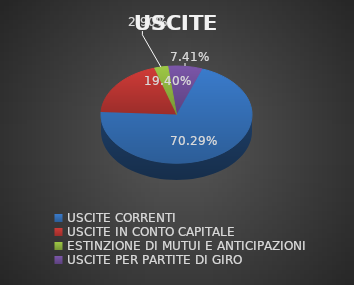
| Category | USCITE |
|---|---|
| USCITE CORRENTI | 0.703 |
| USCITE IN CONTO CAPITALE | 0.194 |
| ESTINZIONE DI MUTUI E ANTICIPAZIONI | 0.029 |
| USCITE PER PARTITE DI GIRO | 0.074 |